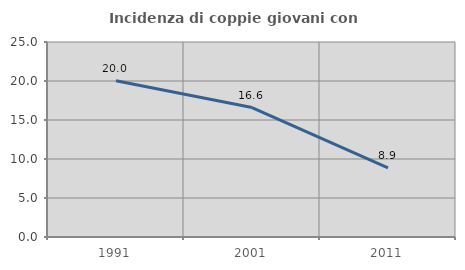
| Category | Incidenza di coppie giovani con figli |
|---|---|
| 1991.0 | 20.035 |
| 2001.0 | 16.591 |
| 2011.0 | 8.869 |